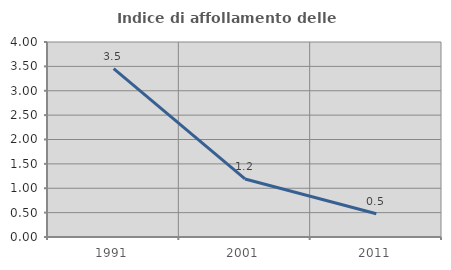
| Category | Indice di affollamento delle abitazioni  |
|---|---|
| 1991.0 | 3.454 |
| 2001.0 | 1.191 |
| 2011.0 | 0.478 |